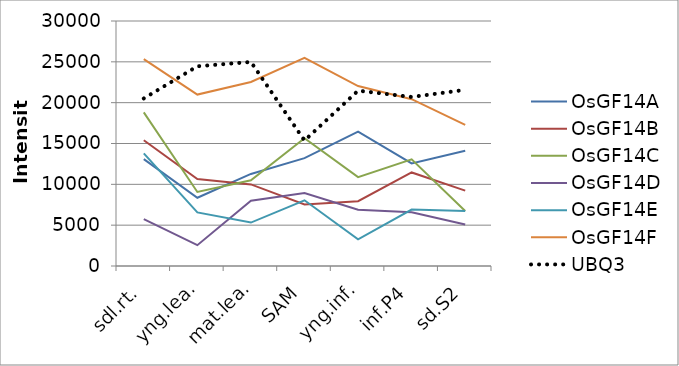
| Category | OsGF14A | OsGF14B | OsGF14C | OsGF14D | OsGF14E | OsGF14F | UBQ3 |
|---|---|---|---|---|---|---|---|
| sdl.rt. | 13091.8 | 15405.73 | 18814 | 5730.46 | 13788.23 | 25327.4 | 20515.43 |
| yng.lea. | 8355.58 | 10639.25 | 9062.33 | 2548.76 | 6562.51 | 20991.33 | 24455.8 |
| mat.lea. | 11271.03 | 9991.91 | 10500.1 | 8001.32 | 5318.54 | 22534.3 | 24987.06 |
| SAM | 13211.63 | 7531.66 | 15652.73 | 8936.58 | 8046.27 | 25486.16 | 15359.6 |
| yng.inf. | 16443.83 | 7935.93 | 10880.83 | 6882.33 | 3268.19 | 22038.09 | 21468.83 |
| inf.P4 | 12553.83 | 11456.86 | 13064.79 | 6581.03 | 6908.1 | 20423.1 | 20697.39 |
| sd.S2 | 14102.46 | 9223.98 | 6741.68 | 5082.29 | 6732.13 | 17268.73 | 21568.03 |